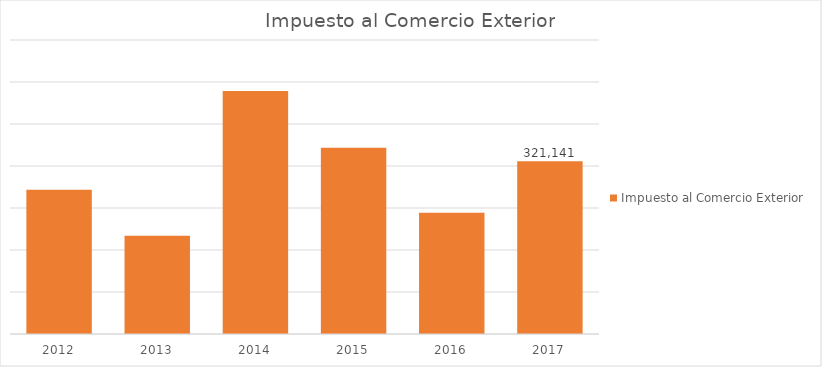
| Category | Impuesto al Comercio Exterior |
|---|---|
| 2012.0 | 314340.451 |
| 2013.0 | 303397.039 |
| 2014.0 | 337842.576 |
| 2015.0 | 324333.845 |
| 2016.0 | 308863.574 |
| 2017.0 | 321140.683 |